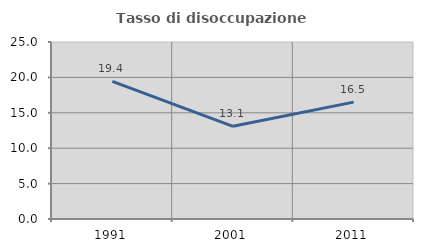
| Category | Tasso di disoccupazione giovanile  |
|---|---|
| 1991.0 | 19.435 |
| 2001.0 | 13.089 |
| 2011.0 | 16.511 |